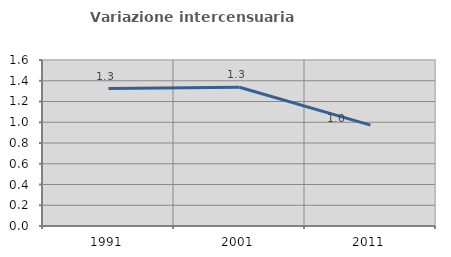
| Category | Variazione intercensuaria annua |
|---|---|
| 1991.0 | 1.325 |
| 2001.0 | 1.338 |
| 2011.0 | 0.973 |